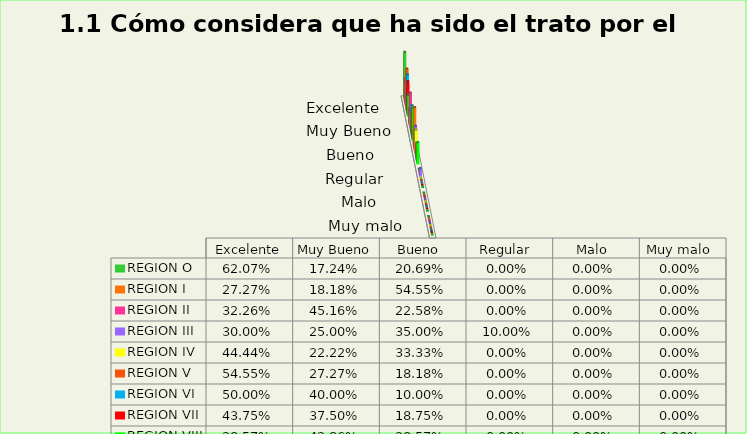
| Category | REGION O | REGION I  | REGION II | REGION III | REGION IV | REGION V  | REGION VI  | REGION VII  | REGION VIII |
|---|---|---|---|---|---|---|---|---|---|
| Excelente | 0.621 | 0.273 | 0.323 | 0.3 | 0.444 | 0.545 | 0.5 | 0.438 | 0.286 |
| Muy Bueno | 0.172 | 0.182 | 0.452 | 0.25 | 0.222 | 0.273 | 0.4 | 0.375 | 0.429 |
| Bueno  | 0.207 | 0.545 | 0.226 | 0.35 | 0.333 | 0.182 | 0.1 | 0.188 | 0.286 |
| Regular  | 0 | 0 | 0 | 0.1 | 0 | 0 | 0 | 0 | 0 |
| Malo  | 0 | 0 | 0 | 0 | 0 | 0 | 0 | 0 | 0 |
| Muy malo  | 0 | 0 | 0 | 0 | 0 | 0 | 0 | 0 | 0 |